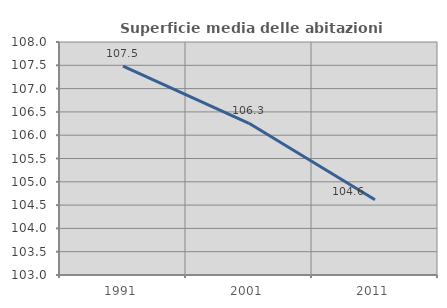
| Category | Superficie media delle abitazioni occupate |
|---|---|
| 1991.0 | 107.484 |
| 2001.0 | 106.256 |
| 2011.0 | 104.614 |